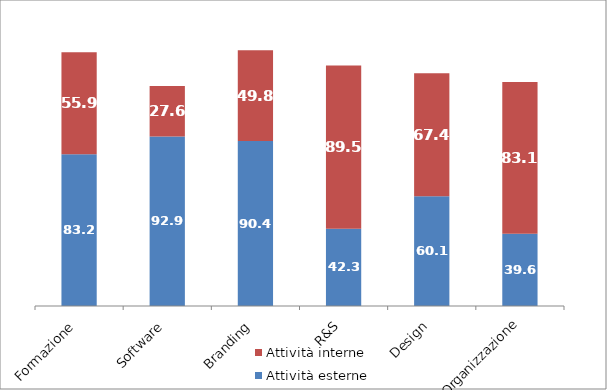
| Category | Attività esterne | Attività interne |
|---|---|---|
| Formazione | 83.2 | 55.9 |
| Software | 92.9 | 27.6 |
| Branding | 90.4 | 49.8 |
| R&S | 42.3 | 89.5 |
| Design | 60.1 | 67.4 |
| Organizzazione | 39.6 | 83.1 |